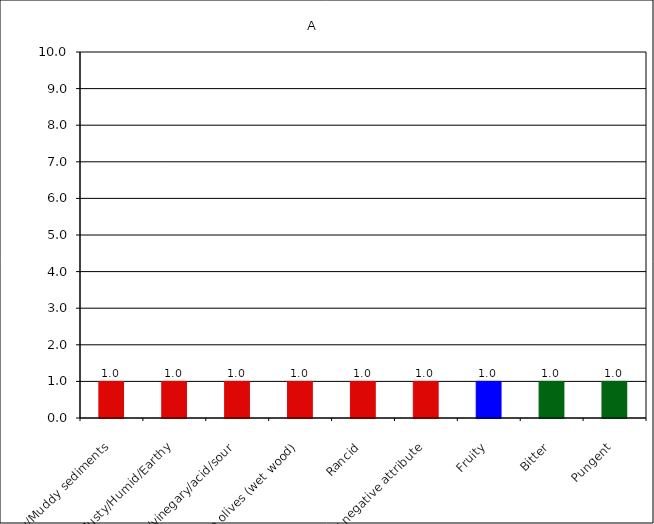
| Category | A |
|---|---|
| Fusty/Muddy sediments | 1 |
| Musty/Humid/Earthy | 1 |
| Winey/vinegary/acid/sour | 1 |
| Frostbitten olives (wet wood) | 1 |
| Rancid | 1 |
| Other negative attribute | 1 |
| Fruity | 1 |
| Bitter | 1 |
| Pungent | 1 |